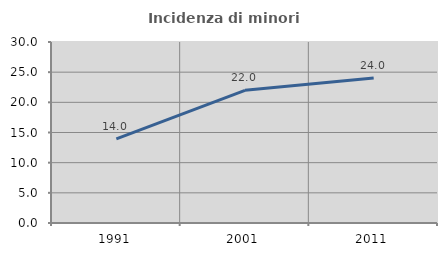
| Category | Incidenza di minori stranieri |
|---|---|
| 1991.0 | 13.953 |
| 2001.0 | 21.992 |
| 2011.0 | 24.024 |